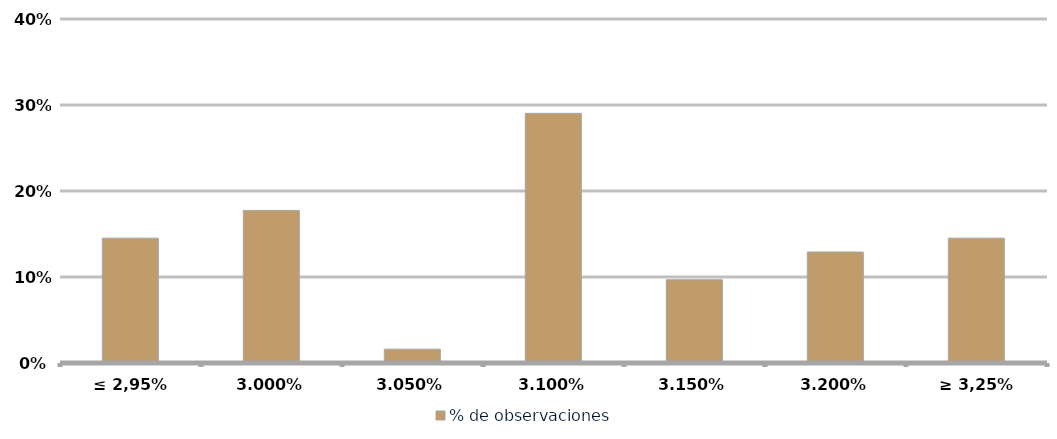
| Category | % de observaciones  |
|---|---|
| ≤ 2,95% | 0.145 |
| 3,00% | 0.177 |
| 3,05% | 0.016 |
| 3,10% | 0.29 |
| 3,15% | 0.097 |
| 3,20% | 0.129 |
| ≥ 3,25% | 0.145 |